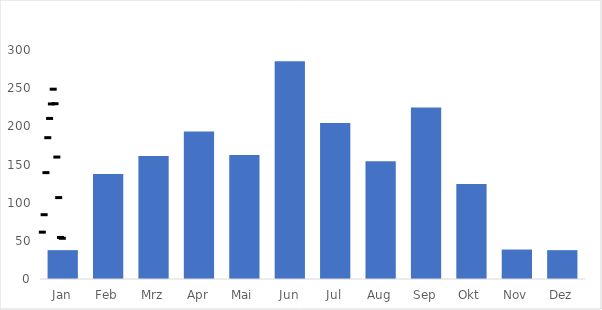
| Category | 2021_ |
|---|---|
| Jan | 37.8 |
| Feb | 137.5 |
| Mrz | 161 |
| Apr | 193.2 |
| Mai | 162.4 |
| Jun | 285.2 |
| Jul | 204.4 |
| Aug | 154.3 |
| Sep | 224.6 |
| Okt | 124.5 |
| Nov | 38.6 |
| Dez | 37.8 |